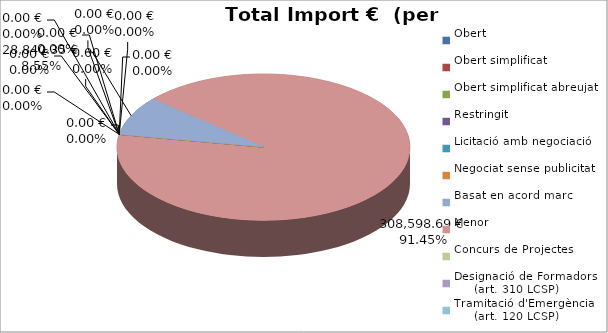
| Category | Total preu
(amb IVA) |
|---|---|
| Obert | 0 |
| Obert simplificat | 0 |
| Obert simplificat abreujat | 0 |
| Restringit | 0 |
| Licitació amb negociació | 0 |
| Negociat sense publicitat | 0 |
| Basat en acord marc | 28840.35 |
| Menor | 308598.69 |
| Concurs de Projectes | 0 |
| Designació de Formadors
     (art. 310 LCSP) | 0 |
| Tramitació d'Emergència
     (art. 120 LCSP) | 0 |